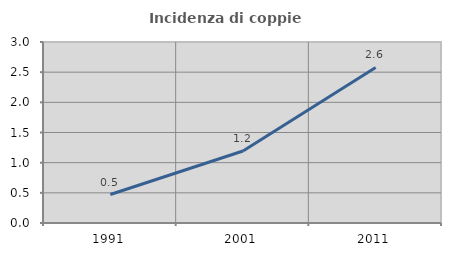
| Category | Incidenza di coppie miste |
|---|---|
| 1991.0 | 0.472 |
| 2001.0 | 1.193 |
| 2011.0 | 2.579 |